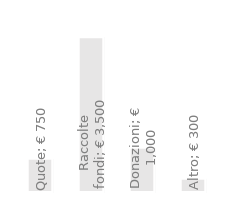
| Category | Entrate annuali |
|---|---|
| Quote | 750 |
| Raccolte fondi | 3500 |
| Donazioni | 1000 |
| Altro | 300 |